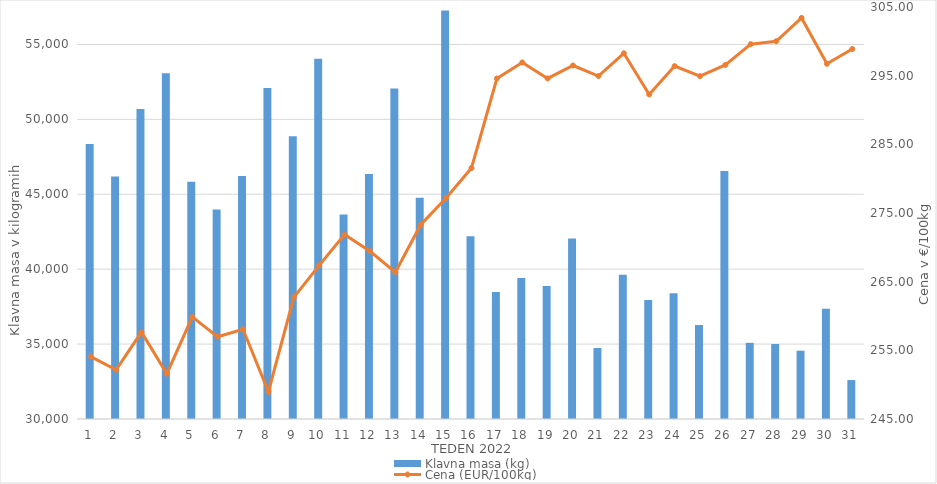
| Category | Klavna masa (kg) |
|---|---|
| 1.0 | 48349 |
| 2.0 | 46187 |
| 3.0 | 50692 |
| 4.0 | 53081 |
| 5.0 | 45844 |
| 6.0 | 43982 |
| 7.0 | 46227 |
| 8.0 | 52099 |
| 9.0 | 48872 |
| 10.0 | 54045 |
| 11.0 | 43645 |
| 12.0 | 46350 |
| 13.0 | 52061 |
| 14.0 | 44774 |
| 15.0 | 57268 |
| 16.0 | 42191 |
| 17.0 | 38469 |
| 18.0 | 39417 |
| 19.0 | 38876 |
| 20.0 | 42047 |
| 21.0 | 34739 |
| 22.0 | 39626 |
| 23.0 | 37939 |
| 24.0 | 38390 |
| 25.0 | 36272 |
| 26.0 | 46553 |
| 27.0 | 35085 |
| 28.0 | 35007 |
| 29.0 | 34559 |
| 30.0 | 37366 |
| 31.0 | 32599 |